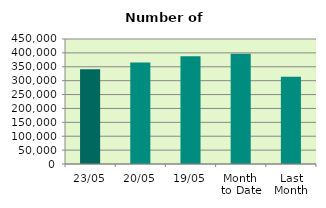
| Category | Series 0 |
|---|---|
| 23/05 | 341292 |
| 20/05 | 365166 |
| 19/05 | 387884 |
| Month 
to Date | 396503.867 |
| Last
Month | 313751.158 |